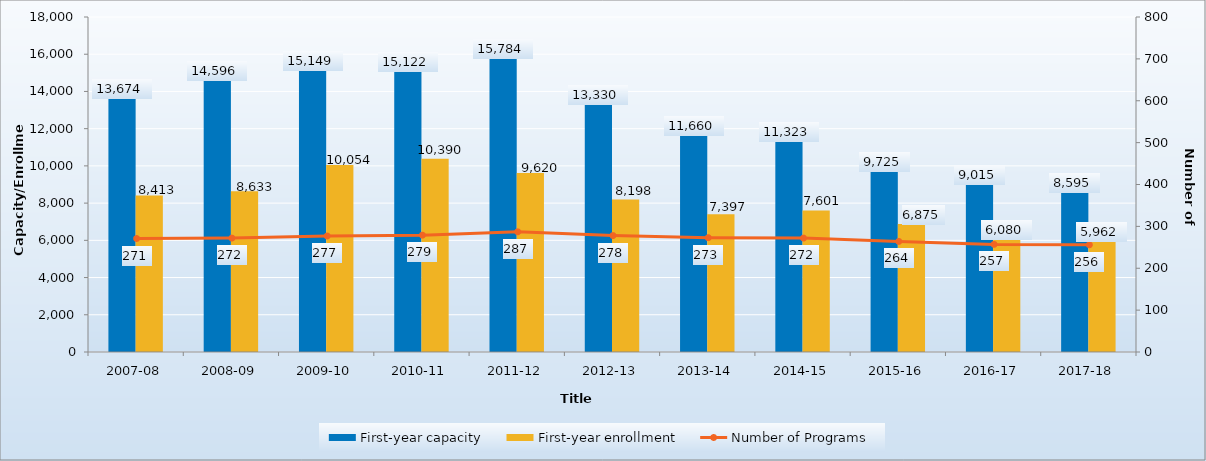
| Category | First-year capacity | First-year enrollment |
|---|---|---|
| 2007-08 | 13674 | 8413 |
| 2008-09 | 14596 | 8633 |
| 2009-10 | 15149 | 10054 |
| 2010-11 | 15122 | 10390 |
| 2011-12 | 15784 | 9620 |
| 2012-13 | 13330 | 8198 |
| 2013-14 | 11660 | 7397 |
| 2014-15 | 11323 | 7601 |
| 2015-16 | 9725 | 6875 |
| 2016-17 | 9015 | 6080 |
| 2017-18 | 8595 | 5962 |